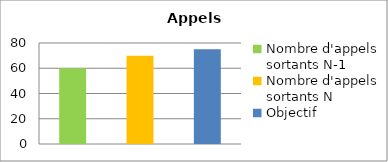
| Category | Series 0 |
|---|---|
| Nombre d'appels sortants N-1 | 60 |
| Nombre d'appels sortants N | 70 |
| Objectif | 75 |